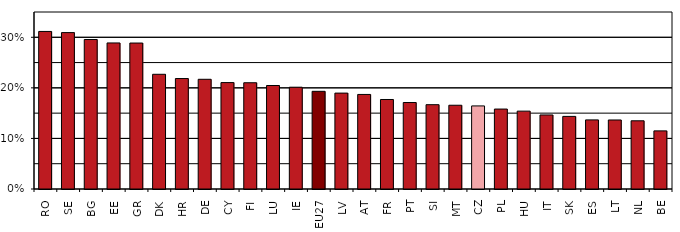
| Category | Series 0 |
|---|---|
| RO | 0.312 |
| SE | 0.309 |
| BG | 0.296 |
| EE | 0.289 |
| GR | 0.289 |
| DK | 0.227 |
| HR | 0.218 |
| DE | 0.217 |
| CY | 0.21 |
| FI | 0.21 |
| LU | 0.205 |
| IE | 0.201 |
| EU27 | 0.193 |
| LV | 0.19 |
| AT | 0.187 |
| FR | 0.177 |
| PT | 0.171 |
| SI | 0.167 |
| MT | 0.166 |
| CZ | 0.164 |
| PL | 0.158 |
| HU | 0.154 |
| IT | 0.146 |
| SK | 0.144 |
| ES | 0.137 |
| LT | 0.136 |
| NL | 0.135 |
| BE | 0.115 |